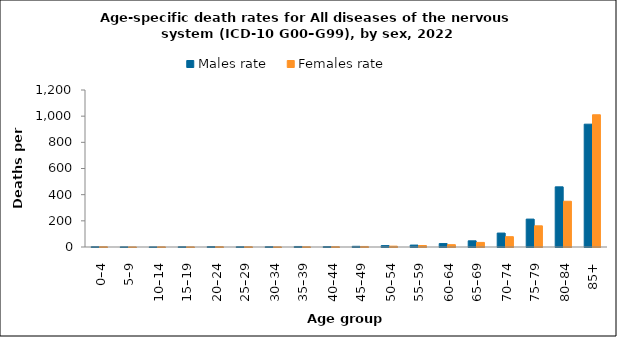
| Category | Males rate | Females rate |
|---|---|---|
| 0–4 | 2.187 | 2.174 |
| 5–9 | 1.085 | 0.639 |
| 10–14 | 0.95 | 1.381 |
| 15–19 | 2.023 | 1.077 |
| 20–24 | 3.31 | 2.4 |
| 25–29 | 2.055 | 1.994 |
| 30–34 | 2.427 | 1.033 |
| 35–39 | 4.041 | 1.782 |
| 40–44 | 3.326 | 2.433 |
| 45–49 | 5.23 | 4.149 |
| 50–54 | 10.566 | 6.43 |
| 55–59 | 14.579 | 11.406 |
| 60–64 | 26.188 | 17.734 |
| 65–69 | 47.185 | 35.079 |
| 70–74 | 106.502 | 78.822 |
| 75–79 | 213.293 | 161.833 |
| 80–84 | 459.879 | 349.622 |
| 85+ | 938.75 | 1010.686 |